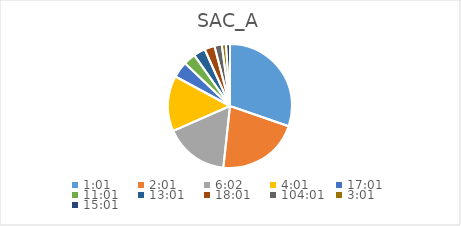
| Category | Series 0 |
|---|---|
| 0.042361111111111106 | 36.372 |
| 0.08402777777777777 | 25.729 |
| 0.2513888888888889 | 20.066 |
| 0.1673611111111111 | 17.374 |
| 0.7090277777777777 | 5.014 |
| 0.4590277777777778 | 3.824 |
| 0.5423611111111112 | 3.678 |
| 0.7506944444444444 | 3.167 |
| 4.334027777777778 | 2.303 |
| 0.12569444444444444 | 1.313 |
| 0.6256944444444444 | 1.243 |